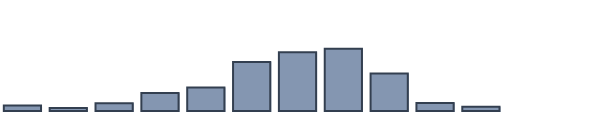
| Category | Series 0 |
|---|---|
| 0 | 1.97 |
| 1 | 1.061 |
| 2 | 2.803 |
| 3 | 6.515 |
| 4 | 8.485 |
| 5 | 17.652 |
| 6 | 21.212 |
| 7 | 22.424 |
| 8 | 13.485 |
| 9 | 2.879 |
| 10 | 1.515 |
| 11 | 0 |
| 12 | 0 |